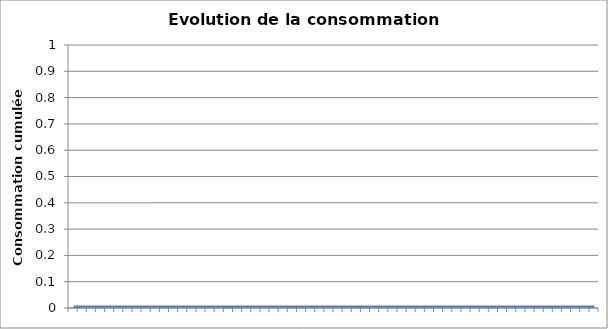
| Category | Consommation cumulée |
|---|---|
|  | 0 |
|  | 0 |
|  | 0 |
|  | 0 |
|  | 0 |
|  | 0 |
|  | 0 |
|  | 0 |
|  | 0 |
|  | 0 |
|  | 0 |
|  | 0 |
|  | 0 |
|  | 0 |
|  | 0 |
|  | 0 |
|  | 0 |
|  | 0 |
|  | 0 |
|  | 0 |
|  | 0 |
|  | 0 |
|  | 0 |
|  | 0 |
|  | 0 |
|  | 0 |
|  | 0 |
|  | 0 |
|  | 0 |
|  | 0 |
|  | 0 |
|  | 0 |
|  | 0 |
|  | 0 |
|  | 0 |
|  | 0 |
|  | 0 |
|  | 0 |
|  | 0 |
|  | 0 |
|  | 0 |
|  | 0 |
|  | 0 |
|  | 0 |
|  | 0 |
|  | 0 |
|  | 0 |
|  | 0 |
|  | 0 |
|  | 0 |
|  | 0 |
|  | 0 |
|  | 0 |
|  | 0 |
|  | 0 |
|  | 0 |
|  | 0 |
|  | 0 |